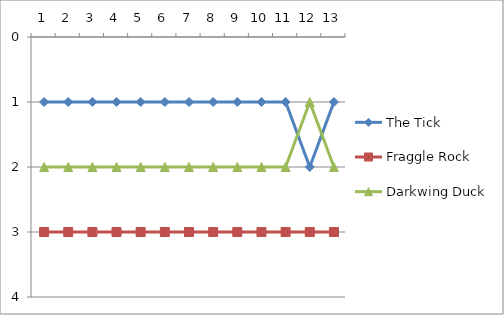
| Category | The Tick | Fraggle Rock | Darkwing Duck |
|---|---|---|---|
| 0 | 1 | 3 | 2 |
| 1 | 1 | 3 | 2 |
| 2 | 1 | 3 | 2 |
| 3 | 1 | 3 | 2 |
| 4 | 1 | 3 | 2 |
| 5 | 1 | 3 | 2 |
| 6 | 1 | 3 | 2 |
| 7 | 1 | 3 | 2 |
| 8 | 1 | 3 | 2 |
| 9 | 1 | 3 | 2 |
| 10 | 1 | 3 | 2 |
| 11 | 2 | 3 | 1 |
| 12 | 1 | 3 | 2 |